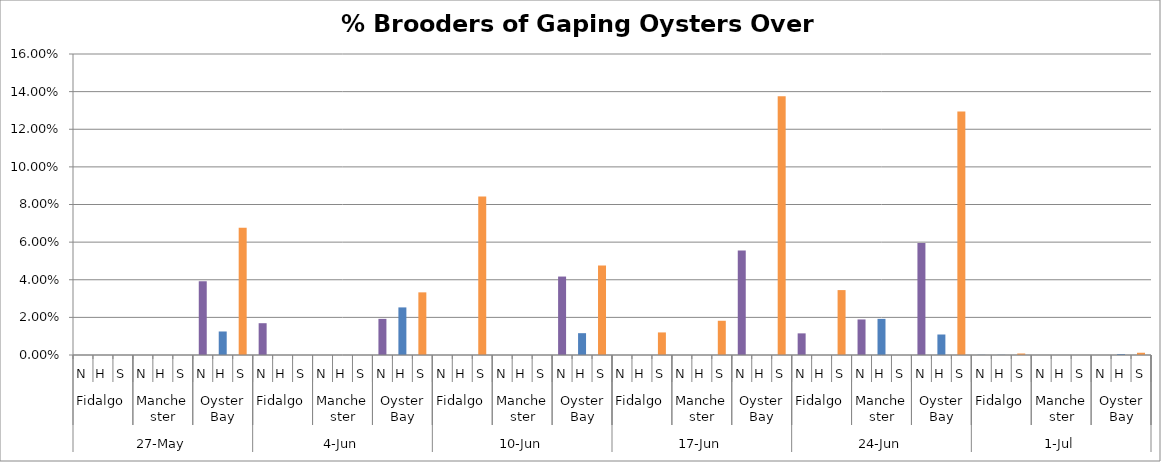
| Category | % Brooders |
|---|---|
| 0 | 0 |
| 1 | 0 |
| 2 | 0 |
| 3 | 0 |
| 4 | 0 |
| 5 | 0 |
| 6 | 0.039 |
| 7 | 0.012 |
| 8 | 0.068 |
| 9 | 0.017 |
| 10 | 0 |
| 11 | 0 |
| 12 | 0 |
| 13 | 0 |
| 14 | 0 |
| 15 | 0.019 |
| 16 | 0.025 |
| 17 | 0.033 |
| 18 | 0 |
| 19 | 0 |
| 20 | 0.084 |
| 21 | 0 |
| 22 | 0 |
| 23 | 0 |
| 24 | 0.042 |
| 25 | 0.012 |
| 26 | 0.048 |
| 27 | 0 |
| 28 | 0 |
| 29 | 0.012 |
| 30 | 0 |
| 31 | 0 |
| 32 | 0.018 |
| 33 | 0.056 |
| 34 | 0 |
| 35 | 0.138 |
| 36 | 0.012 |
| 37 | 0 |
| 38 | 0.034 |
| 39 | 0.019 |
| 40 | 0.019 |
| 41 | 0 |
| 42 | 0.06 |
| 43 | 0.011 |
| 44 | 0.129 |
| 45 | 0 |
| 46 | 0 |
| 47 | 0.001 |
| 48 | 0 |
| 49 | 0 |
| 50 | 0 |
| 51 | 0 |
| 52 | 0 |
| 53 | 0.001 |